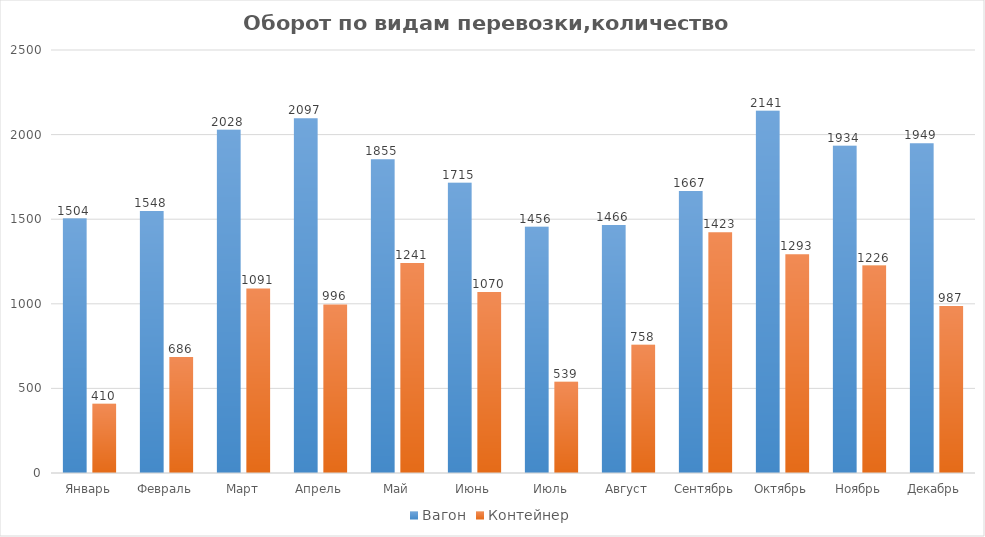
| Category | Вагон | Контейнер |
|---|---|---|
| Январь | 1504 | 410 |
| Февраль | 1548 | 686 |
| Март | 2028 | 1091 |
| Апрель | 2097 | 996 |
| Май | 1855 | 1241 |
| Июнь | 1715 | 1070 |
| Июль | 1456 | 539 |
| Август | 1466 | 758 |
| Сентябрь | 1667 | 1423 |
| Октябрь | 2141 | 1293 |
| Ноябрь | 1934 | 1226 |
| Декабрь | 1949 | 987 |